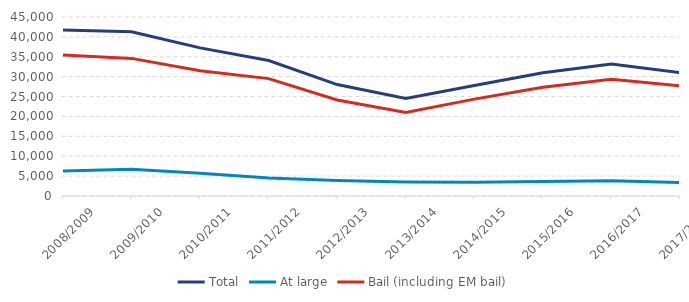
| Category | Total | At large | Bail (including EM bail) |
|---|---|---|---|
| 2008/2009 | 41752 | 6279 | 35473 |
| 2009/2010 | 41295 | 6701 | 34594 |
| 2010/2011 | 37244 | 5747 | 31497 |
| 2011/2012 | 34055 | 4546 | 29509 |
| 2012/2013 | 28015 | 3885 | 24130 |
| 2013/2014 | 24522 | 3528 | 20994 |
| 2014/2015 | 27790 | 3435 | 24355 |
| 2015/2016 | 30993 | 3661 | 27332 |
| 2016/2017 | 33156 | 3838 | 29318 |
| 2017/2018 | 31031 | 3366 | 27665 |